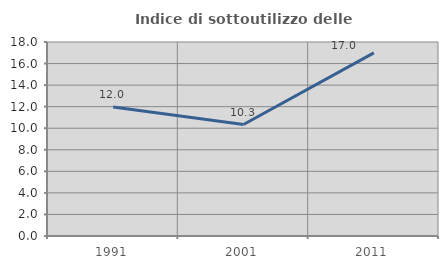
| Category | Indice di sottoutilizzo delle abitazioni  |
|---|---|
| 1991.0 | 11.966 |
| 2001.0 | 10.345 |
| 2011.0 | 16.993 |